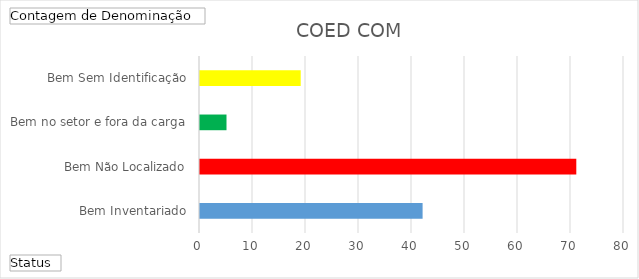
| Category | Total |
|---|---|
| Bem Inventariado | 42 |
| Bem Não Localizado | 71 |
| Bem no setor e fora da carga | 5 |
| Bem Sem Identificação | 19 |